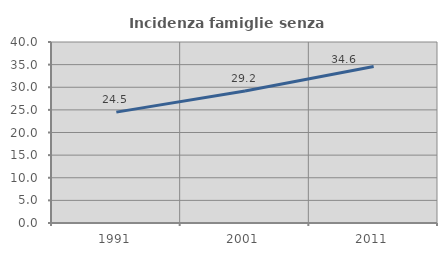
| Category | Incidenza famiglie senza nuclei |
|---|---|
| 1991.0 | 24.507 |
| 2001.0 | 29.179 |
| 2011.0 | 34.571 |